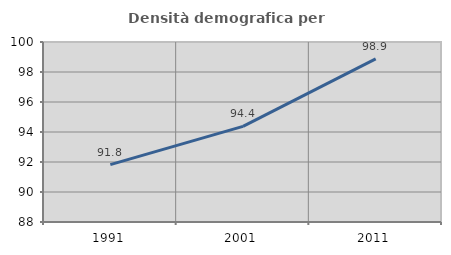
| Category | Densità demografica |
|---|---|
| 1991.0 | 91.824 |
| 2001.0 | 94.372 |
| 2011.0 | 98.88 |